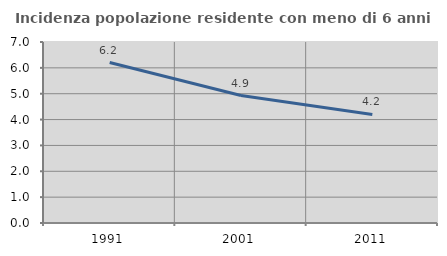
| Category | Incidenza popolazione residente con meno di 6 anni |
|---|---|
| 1991.0 | 6.205 |
| 2001.0 | 4.931 |
| 2011.0 | 4.199 |